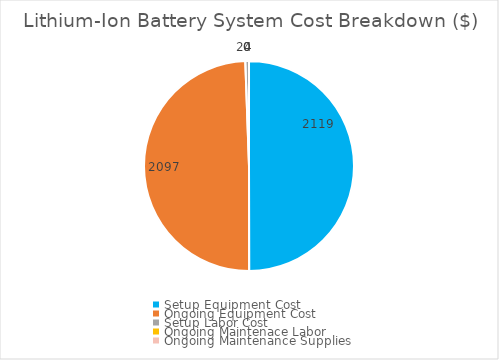
| Category | Series 0 |
|---|---|
| Setup Equipment Cost | 2119 |
| Ongoing Equipment Cost | 2097 |
| Setup Labor Cost | 24 |
| Ongoing Maintenace Labor | 0 |
| Ongoing Maintenance Supplies | 0 |